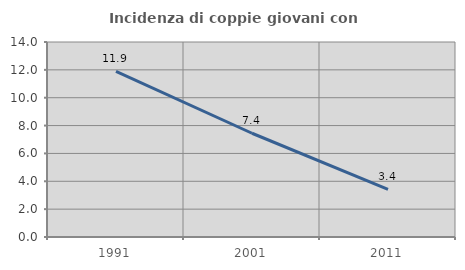
| Category | Incidenza di coppie giovani con figli |
|---|---|
| 1991.0 | 11.885 |
| 2001.0 | 7.448 |
| 2011.0 | 3.426 |